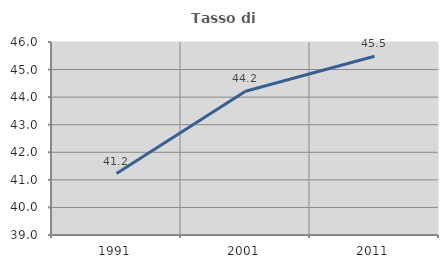
| Category | Tasso di occupazione   |
|---|---|
| 1991.0 | 41.228 |
| 2001.0 | 44.214 |
| 2011.0 | 45.482 |